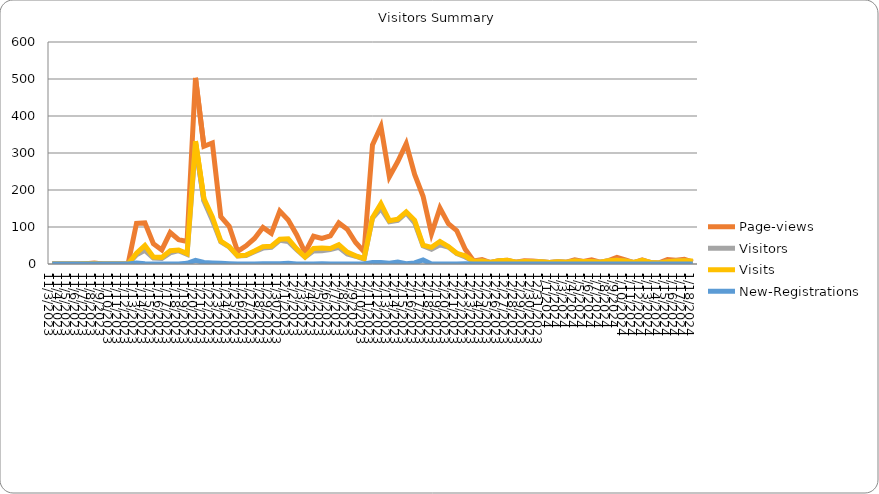
| Category | Date | Page-views | Visitors | Visits | New-Registrations |
|---|---|---|---|---|---|
| 11/3/23 |  | 0 | 0 | 0 | 0 |
| 11/4/23 |  | 0 | 0 | 0 | 0 |
| 11/5/23 |  | 0 | 0 | 0 | 0 |
| 11/6/23 |  | 0 | 0 | 0 | 0 |
| 11/7/23 |  | 1 | 1 | 1 | 0 |
| 11/8/23 |  | 3 | 1 | 1 | 0 |
| 11/9/23 |  | 0 | 0 | 0 | 0 |
| 11/10/23 |  | 0 | 0 | 0 | 0 |
| 11/11/23 |  | 0 | 0 | 0 | 0 |
| 11/12/23 |  | 0 | 0 | 0 | 0 |
| 11/13/23 |  | 110 | 25 | 29 | 3 |
| 11/14/23 |  | 111 | 37 | 50 | 1 |
| 11/15/23 |  | 55 | 16 | 19 | 0 |
| 11/16/23 |  | 38 | 15 | 18 | 0 |
| 11/17/23 |  | 85 | 30 | 36 | 0 |
| 11/18/23 |  | 66 | 36 | 38 | 0 |
| 11/19/23 |  | 61 | 26 | 28 | 2 |
| 11/20/23 |  | 503 | 324 | 332 | 10 |
| 11/21/23 |  | 318 | 170 | 177 | 4 |
| 11/22/23 |  | 327 | 118 | 127 | 3 |
| 11/23/23 |  | 128 | 60 | 62 | 2 |
| 11/24/23 |  | 102 | 46 | 47 | 1 |
| 11/25/23 |  | 34 | 22 | 22 | 0 |
| 11/26/23 |  | 49 | 23 | 24 | 0 |
| 11/27/23 |  | 69 | 33 | 35 | 0 |
| 11/28/23 |  | 99 | 43 | 47 | 1 |
| 11/29/23 |  | 83 | 45 | 48 | 1 |
| 11/30/23 |  | 143 | 64 | 67 | 1 |
| 12/1/23 |  | 119 | 61 | 68 | 2 |
| 12/2/23 |  | 79 | 39 | 41 | 0 |
| 12/3/23 |  | 31 | 19 | 19 | 0 |
| 12/4/23 |  | 75 | 35 | 42 | 0 |
| 12/5/23 |  | 69 | 36 | 43 | 1 |
| 12/6/23 |  | 76 | 39 | 42 | 0 |
| 12/7/23 |  | 111 | 45 | 52 | 0 |
| 12/8/23 |  | 94 | 27 | 32 | 0 |
| 12/9/23 |  | 58 | 21 | 22 | 0 |
| 12/10/23 |  | 33 | 13 | 15 | 0 |
| 12/11/23 |  | 322 | 124 | 125 | 4 |
| 12/12/23 |  | 372 | 150 | 163 | 4 |
| 12/13/23 |  | 236 | 114 | 117 | 2 |
| 12/14/23 |  | 277 | 118 | 121 | 5 |
| 12/15/23 |  | 325 | 138 | 141 | 1 |
| 12/16/23 |  | 242 | 111 | 118 | 3 |
| 12/17/23 |  | 183 | 49 | 51 | 11 |
| 12/18/23 |  | 82 | 40 | 45 | 0 |
| 12/19/23 |  | 151 | 52 | 61 | 0 |
| 12/20/23 |  | 109 | 46 | 47 | 0 |
| 12/21/23 |  | 90 | 28 | 29 | 0 |
| 12/22/23 |  | 40 | 19 | 22 | 1 |
| 12/23/23 |  | 8 | 7 | 7 | 0 |
| 12/24/23 |  | 12 | 8 | 8 | 0 |
| 12/25/23 |  | 4 | 4 | 4 | 0 |
| 12/26/23 |  | 9 | 9 | 9 | 0 |
| 12/27/23 |  | 10 | 9 | 10 | 0 |
| 12/28/23 |  | 5 | 5 | 5 | 0 |
| 12/29/23 |  | 9 | 7 | 7 | 0 |
| 12/30/23 |  | 8 | 6 | 6 | 0 |
| 12/31/23 |  | 6 | 6 | 6 | 0 |
| 1/1/24 |  | 4 | 4 | 4 | 0 |
| 1/2/24 |  | 6 | 6 | 6 | 0 |
| 1/3/24 |  | 5 | 5 | 5 | 0 |
| 1/4/24 |  | 11 | 8 | 8 | 0 |
| 1/5/24 |  | 7 | 7 | 7 | 0 |
| 1/6/24 |  | 11 | 7 | 7 | 0 |
| 1/7/24 |  | 5 | 5 | 5 | 0 |
| 1/8/24 |  | 9 | 9 | 9 | 0 |
| 1/9/24 |  | 18 | 10 | 10 | 0 |
| 1/10/24 |  | 11 | 8 | 8 | 0 |
| 1/11/24 |  | 4 | 4 | 4 | 0 |
| 1/12/24 |  | 11 | 9 | 10 | 0 |
| 1/13/24 |  | 4 | 4 | 4 | 0 |
| 1/14/24 |  | 3 | 3 | 3 | 0 |
| 1/15/24 |  | 12 | 6 | 6 | 0 |
| 1/16/24 |  | 10 | 8 | 8 | 0 |
| 1/17/24 |  | 13 | 9 | 9 | 0 |
| 1/18/24 |  | 5 | 6 | 8 | 0 |